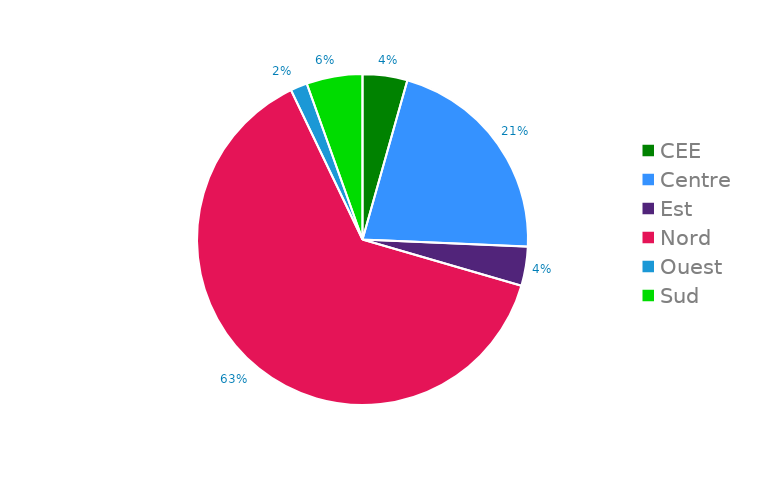
| Category | Qté Vendues |
|---|---|
| CEE | 8 |
| Centre | 39 |
| Est | 7 |
| Nord | 116 |
| Ouest | 3 |
| Sud | 10 |